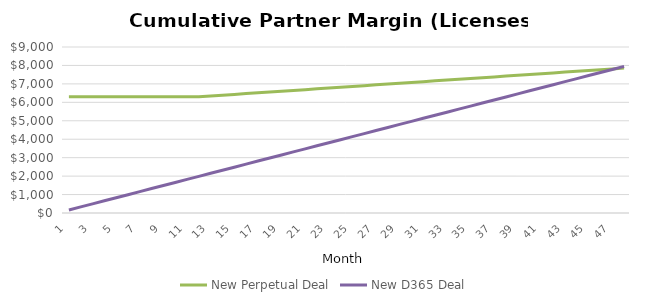
| Category | New Perpetual Deal | New D365 Deal |
|---|---|---|
| 1.0 | 6300 | 165.6 |
| 2.0 | 6300 | 331.2 |
| 3.0 | 6300 | 496.8 |
| 4.0 | 6300 | 662.4 |
| 5.0 | 6300 | 828 |
| 6.0 | 6300 | 993.6 |
| 7.0 | 6300 | 1159.2 |
| 8.0 | 6300 | 1324.8 |
| 9.0 | 6300 | 1490.4 |
| 10.0 | 6300 | 1656 |
| 11.0 | 6300 | 1821.6 |
| 12.0 | 6300 | 1987.2 |
| 13.0 | 6343.2 | 2152.8 |
| 14.0 | 6386.4 | 2318.4 |
| 15.0 | 6429.6 | 2484 |
| 16.0 | 6472.8 | 2649.6 |
| 17.0 | 6516 | 2815.2 |
| 18.0 | 6559.2 | 2980.8 |
| 19.0 | 6602.4 | 3146.4 |
| 20.0 | 6645.6 | 3312 |
| 21.0 | 6688.8 | 3477.6 |
| 22.0 | 6732 | 3643.2 |
| 23.0 | 6775.2 | 3808.8 |
| 24.0 | 6818.4 | 3974.4 |
| 25.0 | 6861.6 | 4140 |
| 26.0 | 6904.8 | 4305.6 |
| 27.0 | 6948 | 4471.2 |
| 28.0 | 6991.2 | 4636.8 |
| 29.0 | 7034.4 | 4802.4 |
| 30.0 | 7077.6 | 4968 |
| 31.0 | 7120.8 | 5133.6 |
| 32.0 | 7164 | 5299.2 |
| 33.0 | 7207.2 | 5464.8 |
| 34.0 | 7250.4 | 5630.4 |
| 35.0 | 7293.6 | 5796 |
| 36.0 | 7336.8 | 5961.6 |
| 37.0 | 7380 | 6127.2 |
| 38.0 | 7423.2 | 6292.8 |
| 39.0 | 7466.4 | 6458.4 |
| 40.0 | 7509.6 | 6624 |
| 41.0 | 7552.8 | 6789.6 |
| 42.0 | 7596 | 6955.2 |
| 43.0 | 7639.2 | 7120.8 |
| 44.0 | 7682.4 | 7286.4 |
| 45.0 | 7725.6 | 7452 |
| 46.0 | 7768.8 | 7617.6 |
| 47.0 | 7812 | 7783.2 |
| 48.0 | 7855.2 | 7948.8 |